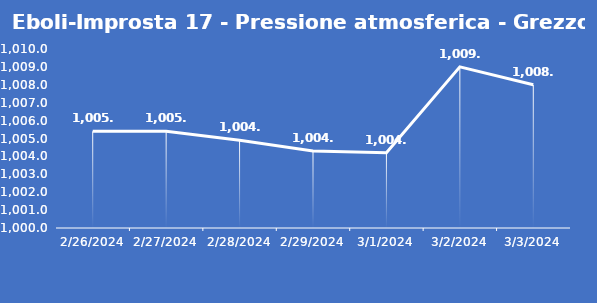
| Category | Eboli-Improsta 17 - Pressione atmosferica - Grezzo (hPa) |
|---|---|
| 2/26/24 | 1005.4 |
| 2/27/24 | 1005.4 |
| 2/28/24 | 1004.9 |
| 2/29/24 | 1004.3 |
| 3/1/24 | 1004.2 |
| 3/2/24 | 1009 |
| 3/3/24 | 1008 |